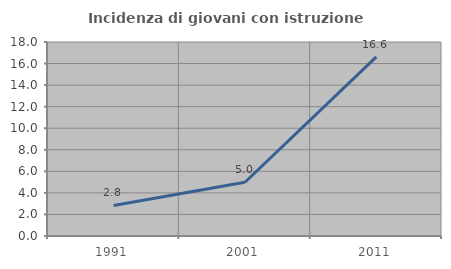
| Category | Incidenza di giovani con istruzione universitaria |
|---|---|
| 1991.0 | 2.837 |
| 2001.0 | 4.988 |
| 2011.0 | 16.614 |